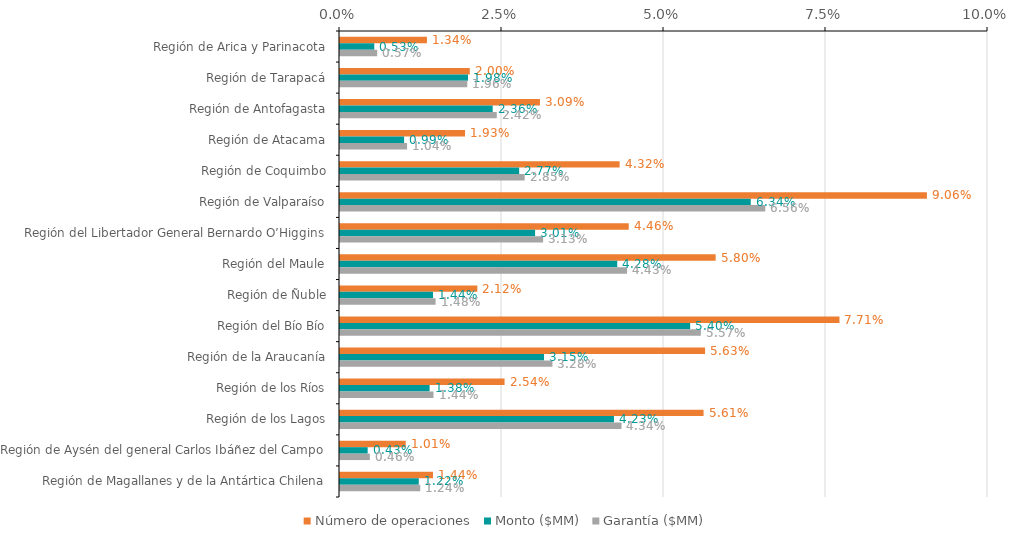
| Category | Número de operaciones | Monto ($MM) | Garantía ($MM) |
|---|---|---|---|
| Región de Arica y Parinacota | 0.013 | 0.005 | 0.006 |
| Región de Tarapacá | 0.02 | 0.02 | 0.02 |
| Región de Antofagasta | 0.031 | 0.024 | 0.024 |
| Región de Atacama | 0.019 | 0.01 | 0.01 |
| Región de Coquimbo | 0.043 | 0.028 | 0.028 |
| Región de Valparaíso | 0.091 | 0.063 | 0.066 |
| Región del Libertador General Bernardo O’Higgins | 0.045 | 0.03 | 0.031 |
| Región del Maule | 0.058 | 0.043 | 0.044 |
| Región de Ñuble | 0.021 | 0.014 | 0.015 |
| Región del Bío Bío | 0.077 | 0.054 | 0.056 |
| Región de la Araucanía | 0.056 | 0.031 | 0.033 |
| Región de los Ríos | 0.025 | 0.014 | 0.014 |
| Región de los Lagos | 0.056 | 0.042 | 0.043 |
| Región de Aysén del general Carlos Ibáñez del Campo | 0.01 | 0.004 | 0.005 |
| Región de Magallanes y de la Antártica Chilena | 0.014 | 0.012 | 0.012 |